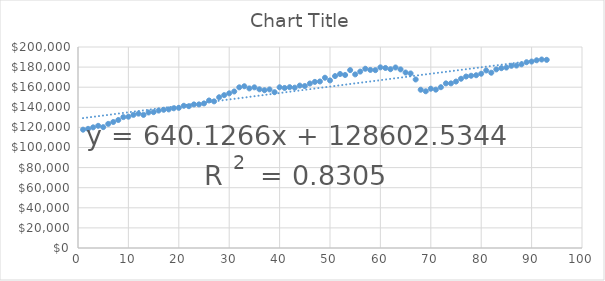
| Category | Series 0 |
|---|---|
| 1.0 | 117719 |
| 2.0 | 118557 |
| 3.0 | 120062 |
| 4.0 | 121571 |
| 5.0 | 120257 |
| 6.0 | 123493 |
| 7.0 | 125379 |
| 8.0 | 127368 |
| 9.0 | 130243 |
| 10.0 | 130626 |
| 11.0 | 132454 |
| 12.0 | 133691 |
| 13.0 | 132427 |
| 14.0 | 134847 |
| 15.0 | 135191 |
| 16.0 | 136734 |
| 17.0 | 137527 |
| 18.0 | 137881 |
| 19.0 | 139023 |
| 20.0 | 139471 |
| 21.0 | 141512 |
| 22.0 | 141104 |
| 23.0 | 142856 |
| 24.0 | 142891 |
| 25.0 | 143854 |
| 26.0 | 146780 |
| 27.0 | 145897 |
| 28.0 | 149986 |
| 29.0 | 152098 |
| 30.0 | 153899 |
| 31.0 | 155752 |
| 32.0 | 159879 |
| 33.0 | 160944 |
| 34.0 | 158792 |
| 35.0 | 159863 |
| 36.0 | 157919 |
| 37.0 | 156998 |
| 38.0 | 157790 |
| 39.0 | 155022 |
| 40.0 | 159923 |
| 41.0 | 159248 |
| 42.0 | 160023 |
| 43.0 | 159529 |
| 44.0 | 161613 |
| 45.0 | 161148 |
| 46.0 | 163670 |
| 47.0 | 165287 |
| 48.0 | 165706 |
| 49.0 | 169413 |
| 50.0 | 166764 |
| 51.0 | 171058 |
| 52.0 | 173136 |
| 53.0 | 172149 |
| 54.0 | 176996 |
| 55.0 | 172746 |
| 56.0 | 175533 |
| 57.0 | 178354 |
| 58.0 | 177195 |
| 59.0 | 176968 |
| 60.0 | 179744 |
| 61.0 | 179136 |
| 62.0 | 177891 |
| 63.0 | 179622 |
| 64.0 | 177697 |
| 65.0 | 174598 |
| 66.0 | 173674 |
| 67.0 | 167695 |
| 68.0 | 157476 |
| 69.0 | 155959 |
| 70.0 | 158490 |
| 71.0 | 157556 |
| 72.0 | 159997 |
| 73.0 | 163801 |
| 74.0 | 163794 |
| 75.0 | 165624 |
| 76.0 | 168413 |
| 77.0 | 170613 |
| 78.0 | 171391 |
| 79.0 | 171903 |
| 80.0 | 173402 |
| 81.0 | 176630 |
| 82.0 | 174423 |
| 83.0 | 177706 |
| 84.0 | 178913 |
| 85.0 | 179544 |
| 86.0 | 181302 |
| 87.0 | 181530 |
| 88.0 | 182764 |
| 89.0 | 184855 |
| 90.0 | 185520 |
| 91.0 | 186773 |
| 92.0 | 187553 |
| 93.0 | 187224 |